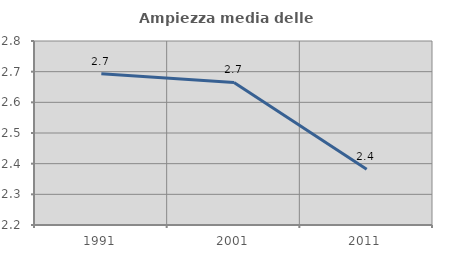
| Category | Ampiezza media delle famiglie |
|---|---|
| 1991.0 | 2.693 |
| 2001.0 | 2.665 |
| 2011.0 | 2.382 |